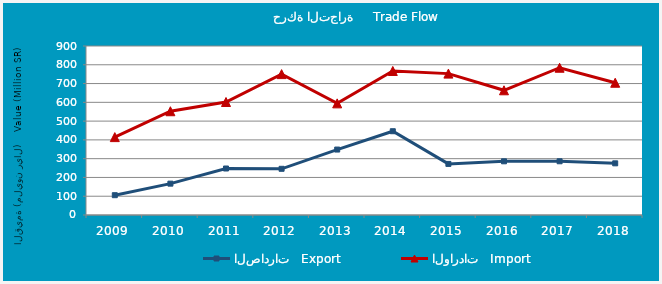
| Category | الصادرات   Export | الواردات   Import |
|---|---|---|
| 2009.0 | 105504276 | 414797397 |
| 2010.0 | 166987589 | 552537517 |
| 2011.0 | 247554131 | 601805235 |
| 2012.0 | 245988965 | 750289888 |
| 2013.0 | 348536955 | 594530203 |
| 2014.0 | 446107482 | 767016752 |
| 2015.0 | 272077804 | 752886948 |
| 2016.0 | 285956545 | 664122953 |
| 2017.0 | 286091097 | 784265711 |
| 2018.0 | 275095871 | 704363581 |